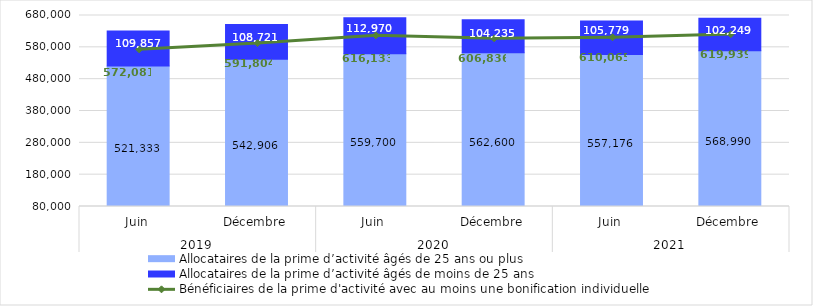
| Category | Allocataires de la prime d’activité âgés de 25 ans ou plus | Allocataires de la prime d’activité âgés de moins de 25 ans |
|---|---|---|
| 0 | 521333 | 109857 |
| 1 | 542906 | 108721 |
| 2 | 559700 | 112970 |
| 3 | 562600 | 104235 |
| 4 | 557176 | 105779 |
| 5 | 568990 | 102249 |